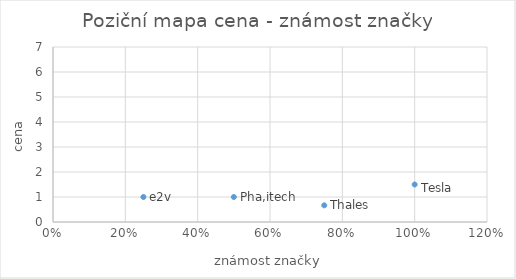
| Category | Series 0 |
|---|---|
| 1.0 | 1.5 |
| 0.75 | 0.667 |
| 0.25 | 1 |
| 0.5 | 1 |